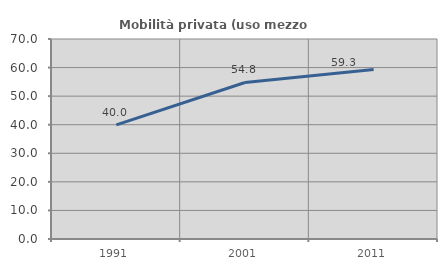
| Category | Mobilità privata (uso mezzo privato) |
|---|---|
| 1991.0 | 39.966 |
| 2001.0 | 54.783 |
| 2011.0 | 59.343 |